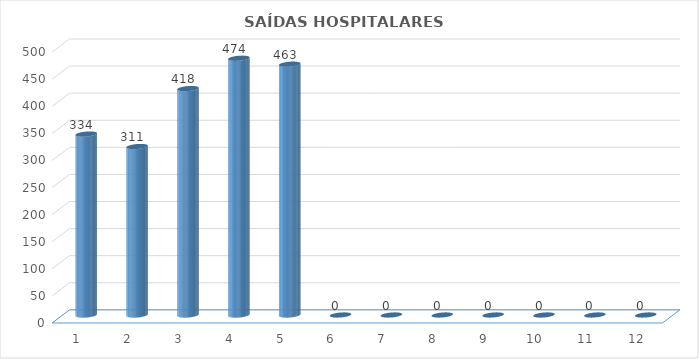
| Category | Series 0 |
|---|---|
| 0 | 334 |
| 1 | 311 |
| 2 | 418 |
| 3 | 474 |
| 4 | 463 |
| 5 | 0 |
| 6 | 0 |
| 7 | 0 |
| 8 | 0 |
| 9 | 0 |
| 10 | 0 |
| 11 | 0 |